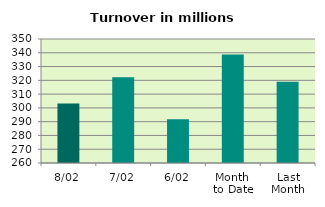
| Category | Series 0 |
|---|---|
| 8/02 | 303.261 |
| 7/02 | 322.229 |
| 6/02 | 291.77 |
| Month 
to Date | 338.832 |
| Last
Month | 318.977 |